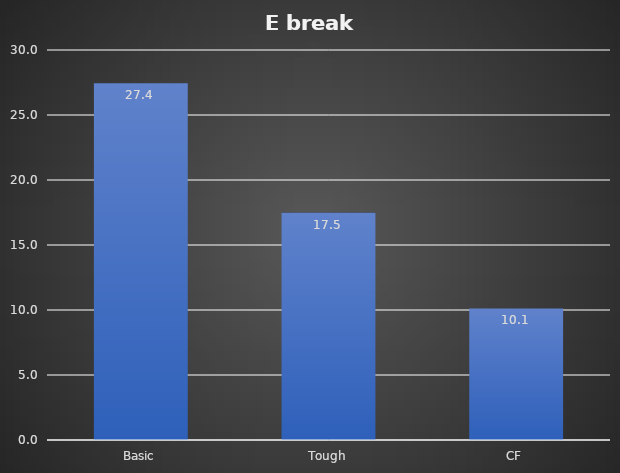
| Category | kJ/m² |
|---|---|
| Basic | 27.437 |
| Tough | 17.474 |
| CF | 10.117 |